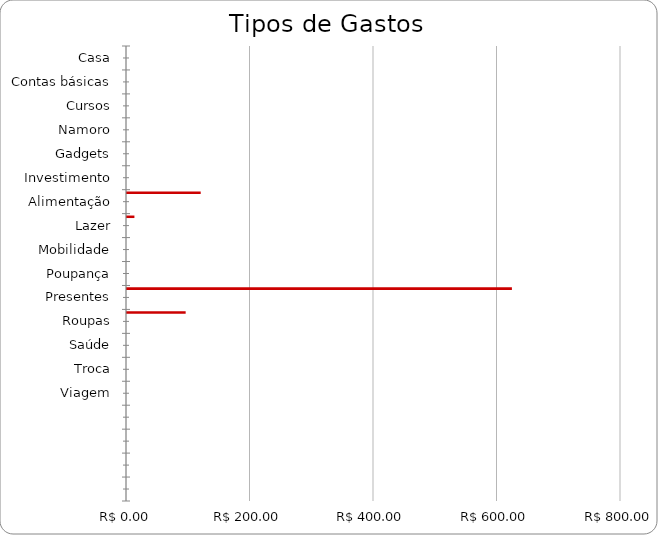
| Category | Series 0 | Series 1 | Series 2 | Series 3 | Series 4 | Series 5 | Series 6 | Series 7 |
|---|---|---|---|---|---|---|---|---|
| Casa | 0 |  |  |  |  |  |  |  |
| Contas básicas | 0 |  |  |  |  |  |  |  |
| Cursos | 0 |  |  |  |  |  |  |  |
| Namoro | 0 |  |  |  |  |  |  |  |
| Gadgets | 0 |  |  |  |  |  |  |  |
| Investimento | 0 |  |  |  |  |  |  |  |
| Alimentação | 119.35 |  |  |  |  |  |  |  |
| Lazer | 12 |  |  |  |  |  |  |  |
| Mobilidade | 0 |  |  |  |  |  |  |  |
| Poupança | 0 |  |  |  |  |  |  |  |
| Presentes | 623.33 |  |  |  |  |  |  |  |
| Roupas | 95 |  |  |  |  |  |  |  |
| Saúde | 0 |  |  |  |  |  |  |  |
| Troca | 0 |  |  |  |  |  |  |  |
| Viagem | 0 |  |  |  |  |  |  |  |